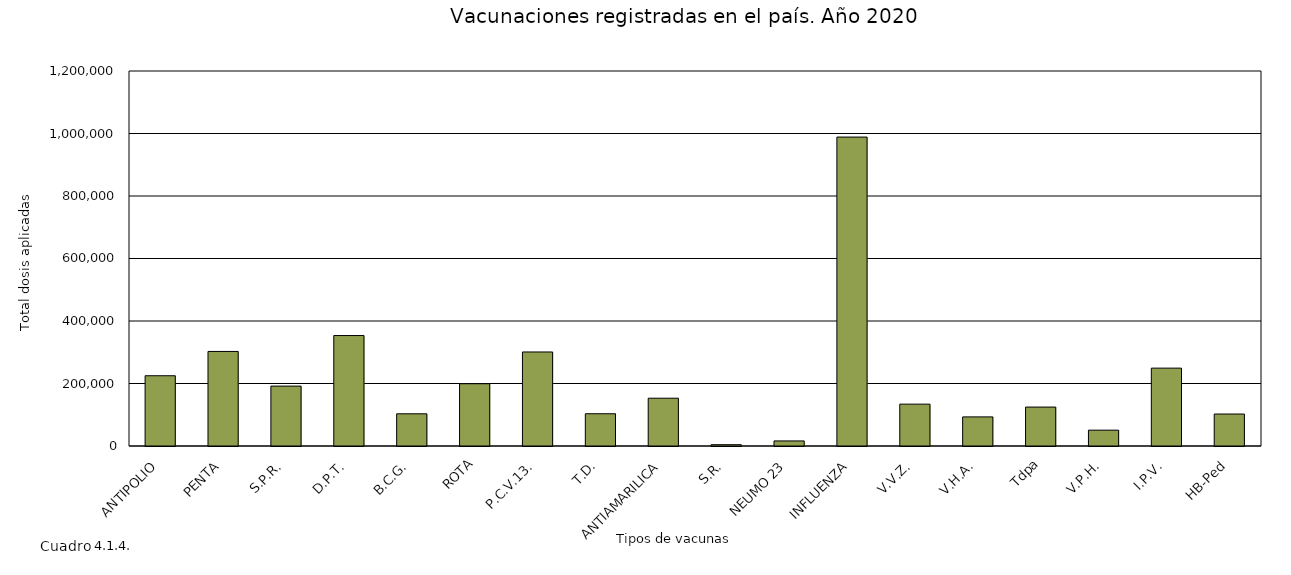
| Category | 2020 |
|---|---|
| ANTIPOLIO | 224848 |
| PENTA | 302581 |
| S.P.R. | 191691 |
| D.P.T. | 353478 |
| B.C.G. | 103009 |
| ROTA | 199209 |
| P.C.V.13. | 300894 |
| T.D. | 103236 |
| ANTIAMARILICA | 152908 |
| S.R. | 4161 |
| NEUMO 23 | 16229 |
| INFLUENZA | 988575 |
| V.V.Z. | 133988 |
| V.H.A. | 93142 |
| Tdpa | 124588 |
| V.P.H. | 50667 |
| I.P.V. | 249162 |
| HB-Ped | 102300 |